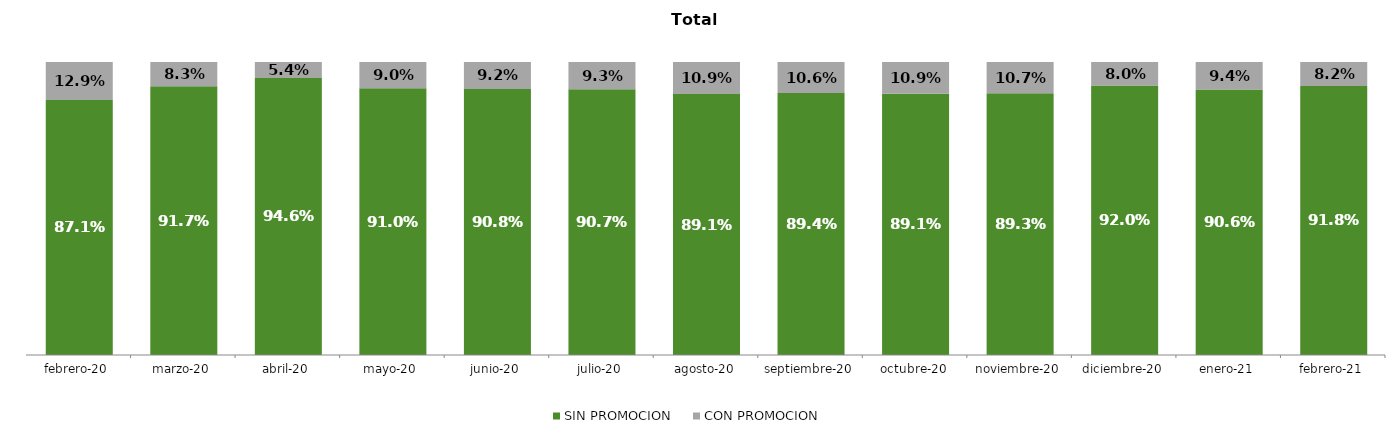
| Category | SIN PROMOCION   | CON PROMOCION   |
|---|---|---|
| 2020-02-01 | 0.871 | 0.129 |
| 2020-03-01 | 0.917 | 0.083 |
| 2020-04-01 | 0.946 | 0.054 |
| 2020-05-01 | 0.91 | 0.09 |
| 2020-06-01 | 0.908 | 0.092 |
| 2020-07-01 | 0.907 | 0.093 |
| 2020-08-01 | 0.891 | 0.109 |
| 2020-09-01 | 0.894 | 0.106 |
| 2020-10-01 | 0.891 | 0.109 |
| 2020-11-01 | 0.893 | 0.107 |
| 2020-12-01 | 0.92 | 0.08 |
| 2021-01-01 | 0.906 | 0.094 |
| 2021-02-01 | 0.918 | 0.082 |